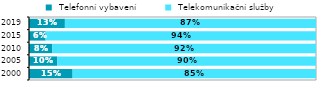
| Category |  Telefonní vybavení  |  Telekomunikační služby |
|---|---|---|
| 2000.0 | 0.152 | 0.848 |
| 2005.0 | 0.098 | 0.902 |
| 2010.0 | 0.081 | 0.919 |
| 2015.0 | 0.058 | 0.942 |
| 2019.0 | 0.125 | 0.875 |